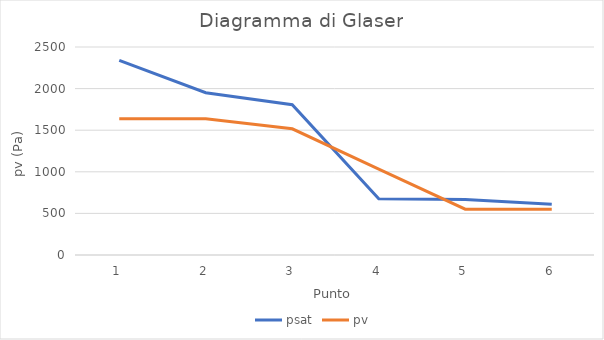
| Category | psat | pv |
|---|---|---|
| 0 | 2338.9 | 1637.23 |
| 1 | 1950.6 | 1637.23 |
| 2 | 1807.1 | 1516.436 |
| 3 | 676.7 | 1033.258 |
| 4 | 666.9 | 550.08 |
| 5 | 611.2 | 550.08 |